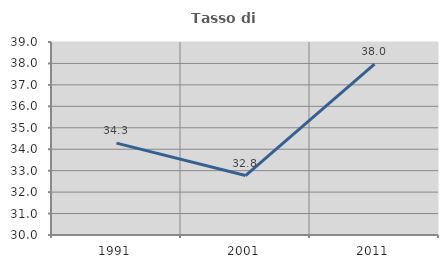
| Category | Tasso di occupazione   |
|---|---|
| 1991.0 | 34.283 |
| 2001.0 | 32.774 |
| 2011.0 | 37.967 |